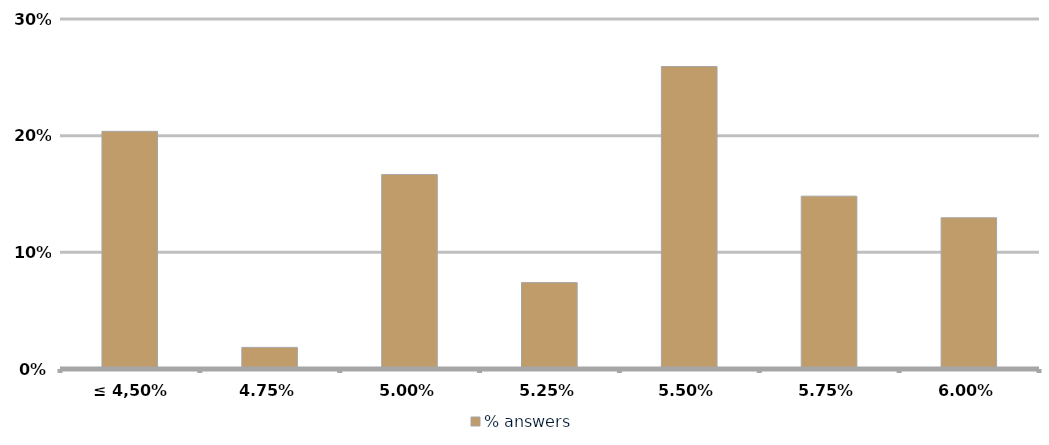
| Category | % answers |
|---|---|
| ≤ 4,50% | 0.204 |
| 4,75% | 0.019 |
| 5,00% | 0.167 |
| 5,25% | 0.074 |
| 5,50% | 0.259 |
| 5,75% | 0.148 |
| 6,00% | 0.13 |